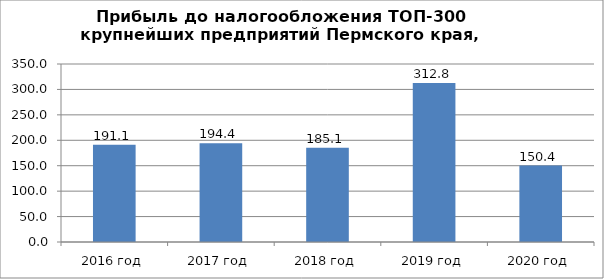
| Category | Прибыль (убыток) до налогообложения |
|---|---|
| 2016 год | 191.1 |
| 2017 год | 194.4 |
| 2018 год | 185.1 |
| 2019 год | 312.8 |
| 2020 год | 150.4 |